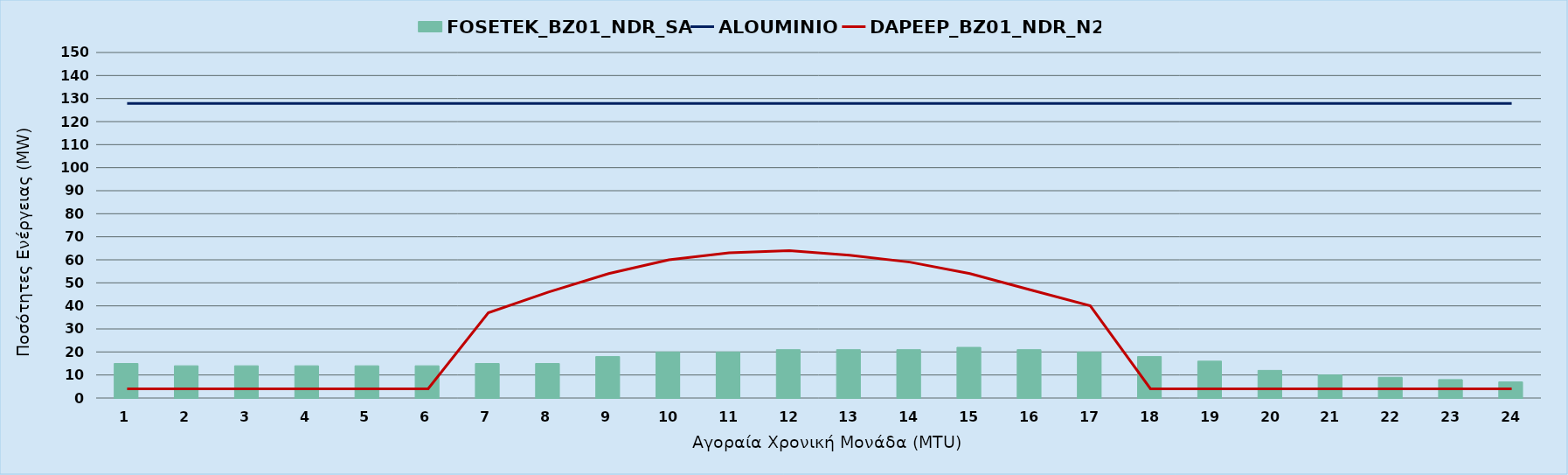
| Category | FOSETEK_BZ01_NDR_SA |
|---|---|
| 0 | 15 |
| 1 | 14 |
| 2 | 14 |
| 3 | 14 |
| 4 | 14 |
| 5 | 14 |
| 6 | 15 |
| 7 | 15 |
| 8 | 18 |
| 9 | 20 |
| 10 | 20 |
| 11 | 21 |
| 12 | 21 |
| 13 | 21 |
| 14 | 22 |
| 15 | 21 |
| 16 | 20 |
| 17 | 18 |
| 18 | 16 |
| 19 | 12 |
| 20 | 10 |
| 21 | 9 |
| 22 | 8 |
| 23 | 7 |